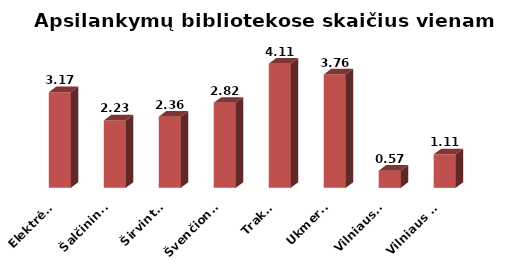
| Category | Series 0 |
|---|---|
|  Elektrėnai | 3.172 |
|  Šalčininkai | 2.233 |
|  Širvintos | 2.36 |
|  Švenčionys | 2.817 |
|  Trakai | 4.113 |
|  Ukmergė | 3.755 |
|  Vilniaus r. | 0.569 |
|  Vilniaus m. | 1.111 |